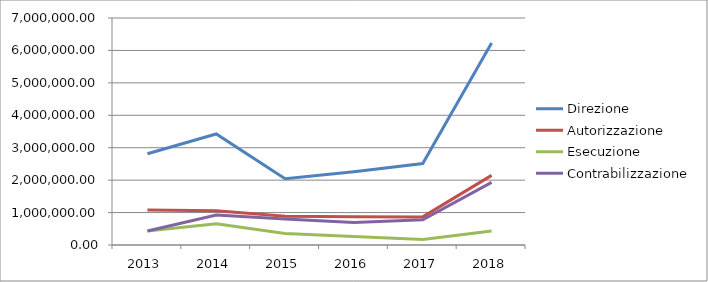
| Category | Direzione | Autorizzazione | Esecuzione | Contrabilizzazione |
|---|---|---|---|---|
| 2013.0 | 2815872.174 | 1083027.759 | 433211.104 | 433211.104 |
| 2014.0 | 3424085.775 | 1053564.854 | 658478.034 | 921869.247 |
| 2015.0 | 2046157.415 | 889633.659 | 355853.463 | 800670.293 |
| 2016.0 | 2260939.399 | 869592.077 | 260877.623 | 695673.661 |
| 2017.0 | 2513647.703 | 866775.07 | 173355.014 | 780097.563 |
| 2018.0 | 6228107.698 | 2147623.344 | 429524.669 | 1932861.01 |